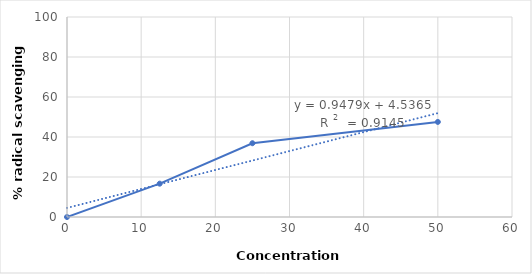
| Category | Series 0 |
|---|---|
| 0.0 | 0 |
| 12.5 | 16.667 |
| 25.0 | 36.884 |
| 50.0 | 47.535 |